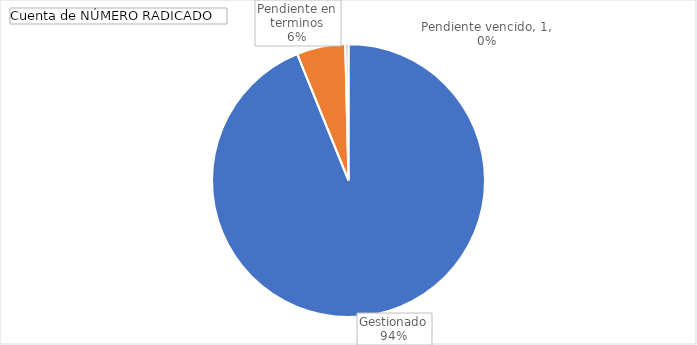
| Category | Total |
|---|---|
| Gestionado | 245 |
| Pendiente en terminos | 15 |
| Pendiente vencido | 1 |